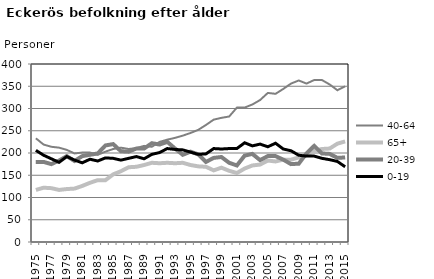
| Category | 40-64 | 65+ | 20-39 | 0-19 |
|---|---|---|---|---|
| 1975.0 | 233 | 117 | 180 | 206 |
| 1976.0 | 219 | 122 | 180 | 195 |
| 1977.0 | 214 | 121 | 175 | 187 |
| 1978.0 | 212 | 117 | 183 | 179 |
| 1979.0 | 207 | 119 | 193 | 192 |
| 1980.0 | 199 | 120 | 182 | 184 |
| 1981.0 | 201 | 126 | 193 | 178 |
| 1982.0 | 201 | 133 | 196 | 186 |
| 1983.0 | 196 | 139 | 199 | 182 |
| 1984.0 | 203 | 139 | 217 | 189 |
| 1985.0 | 209 | 152 | 220 | 188 |
| 1986.0 | 212 | 159 | 204 | 184 |
| 1987.0 | 209 | 168 | 203 | 188 |
| 1988.0 | 211 | 169 | 210 | 192 |
| 1989.0 | 216 | 173 | 210 | 187 |
| 1990.0 | 214 | 178 | 222 | 197 |
| 1991.0 | 225 | 177 | 219 | 201 |
| 1992.0 | 230 | 178 | 225 | 210 |
| 1993.0 | 234 | 177 | 210 | 208 |
| 1994.0 | 239 | 178 | 196 | 207 |
| 1995.0 | 245 | 173 | 203 | 202 |
| 1996.0 | 252 | 170 | 197 | 197 |
| 1997.0 | 263 | 169 | 180 | 198 |
| 1998.0 | 275 | 161 | 189 | 210 |
| 1999.0 | 279 | 167 | 191 | 209 |
| 2000.0 | 282 | 160 | 178 | 210 |
| 2001.0 | 302 | 155 | 172 | 210 |
| 2002.0 | 302 | 165 | 194 | 223 |
| 2003.0 | 309 | 172 | 198 | 216 |
| 2004.0 | 319 | 174 | 184 | 220 |
| 2005.0 | 335 | 183 | 193 | 214 |
| 2006.0 | 333 | 181 | 193 | 222 |
| 2007.0 | 344 | 185 | 185 | 209 |
| 2008.0 | 356 | 185 | 175 | 205 |
| 2009.0 | 363 | 190 | 176 | 195 |
| 2010.0 | 356 | 195 | 199 | 193 |
| 2011.0 | 364 | 205 | 216 | 193 |
| 2012.0 | 364 | 209 | 199 | 188 |
| 2013.0 | 354 | 210 | 198 | 185 |
| 2014.0 | 341 | 221 | 189 | 181 |
| 2015.0 | 350 | 226 | 190 | 169 |